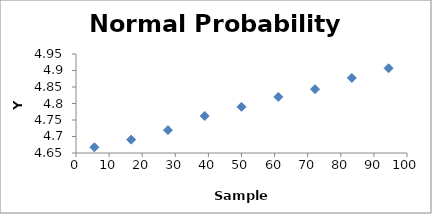
| Category | Series 0 |
|---|---|
| 5.555555555555555 | 4.667 |
| 16.66666666666666 | 4.69 |
| 27.77777777777778 | 4.719 |
| 38.88888888888889 | 4.762 |
| 50.0 | 4.79 |
| 61.11111111111111 | 4.82 |
| 72.22222222222221 | 4.843 |
| 83.33333333333333 | 4.877 |
| 94.44444444444444 | 4.907 |